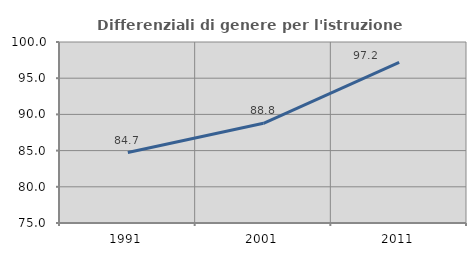
| Category | Differenziali di genere per l'istruzione superiore |
|---|---|
| 1991.0 | 84.729 |
| 2001.0 | 88.773 |
| 2011.0 | 97.196 |